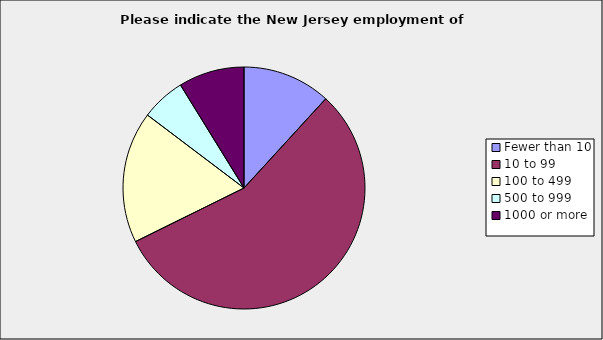
| Category | Series 0 |
|---|---|
| Fewer than 10 | 0.118 |
| 10 to 99 | 0.559 |
| 100 to 499 | 0.176 |
| 500 to 999 | 0.059 |
| 1000 or more | 0.088 |